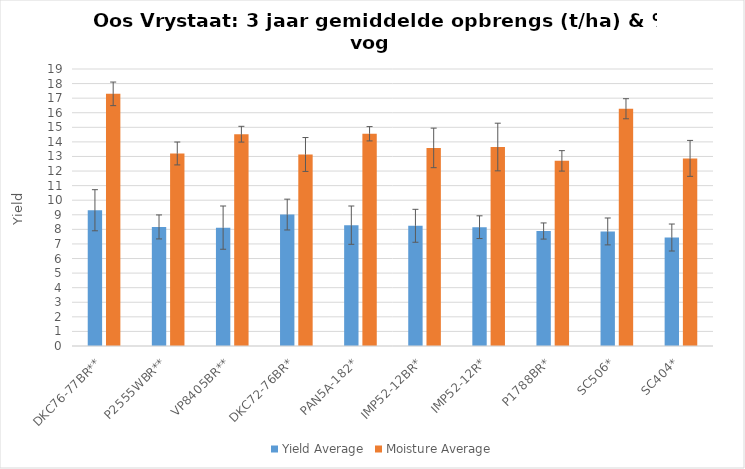
| Category | Yield Average | Moisture Average |
|---|---|---|
| DKC76-77BR** | 9.313 | 17.296 |
| P2555WBR** | 8.167 | 13.206 |
| VP8405BR** | 8.119 | 14.528 |
| DKC72-76BR* | 9.015 | 13.137 |
| PAN5A-182* | 8.289 | 14.558 |
| IMP52-12BR* | 8.245 | 13.587 |
| IMP52-12R* | 8.15 | 13.648 |
| P1788BR* | 7.887 | 12.699 |
| SC506* | 7.858 | 16.274 |
| SC404* | 7.441 | 12.869 |